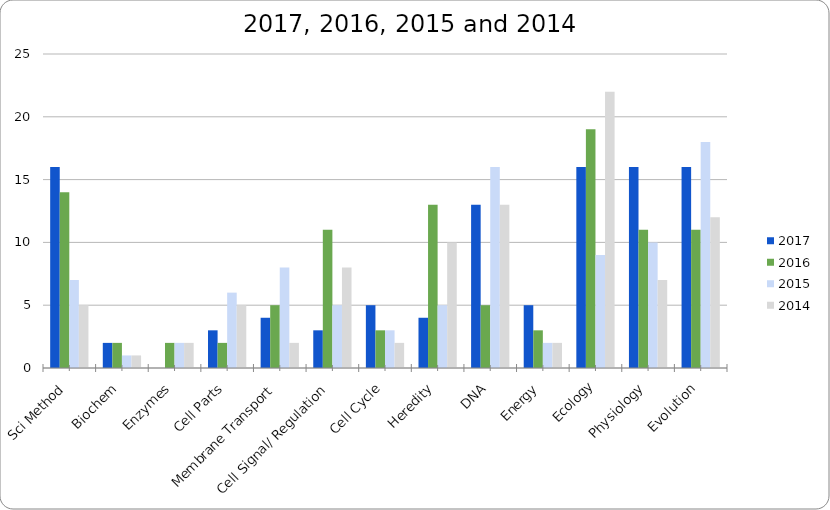
| Category | 2017 | 2016 | 2015 | 2014 |
|---|---|---|---|---|
| Sci Method | 16 | 14 | 7 | 5 |
| Biochem | 2 | 2 | 1 | 1 |
| Enzymes | 0 | 2 | 2 | 2 |
| Cell Parts | 3 | 2 | 6 | 5 |
| Membrane Transport | 4 | 5 | 8 | 2 |
| Cell Signal/ Regulation | 3 | 11 | 5 | 8 |
| Cell Cycle | 5 | 3 | 3 | 2 |
| Heredity | 4 | 13 | 5 | 10 |
| DNA | 13 | 5 | 16 | 13 |
| Energy | 5 | 3 | 2 | 2 |
| Ecology | 16 | 19 | 9 | 22 |
| Physiology | 16 | 11 | 10 | 7 |
| Evolution | 16 | 11 | 18 | 12 |